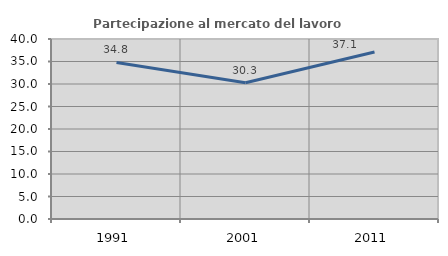
| Category | Partecipazione al mercato del lavoro  femminile |
|---|---|
| 1991.0 | 34.801 |
| 2001.0 | 30.284 |
| 2011.0 | 37.127 |